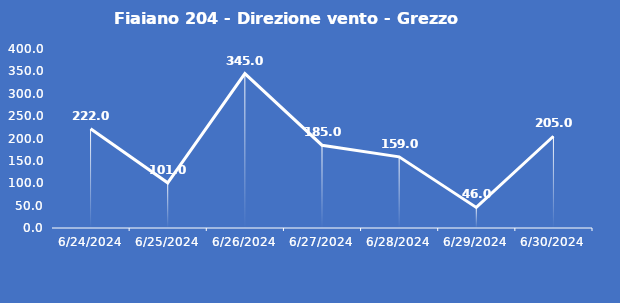
| Category | Fiaiano 204 - Direzione vento - Grezzo (°N) |
|---|---|
| 6/24/24 | 222 |
| 6/25/24 | 101 |
| 6/26/24 | 345 |
| 6/27/24 | 185 |
| 6/28/24 | 159 |
| 6/29/24 | 46 |
| 6/30/24 | 205 |